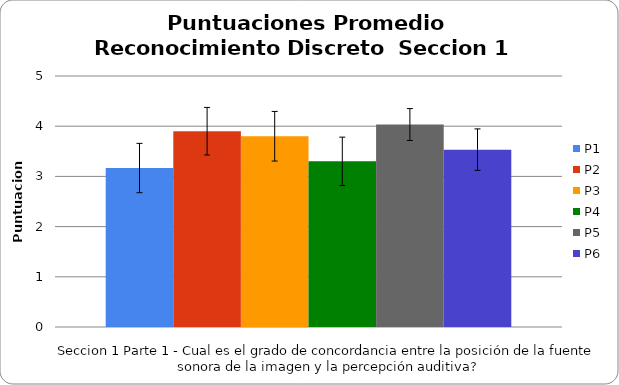
| Category | P1 | P2 | P3 | P4 | P5 | P6 |
|---|---|---|---|---|---|---|
| 0 | 3.167 | 3.9 | 3.8 | 3.3 | 4.033 | 3.533 |